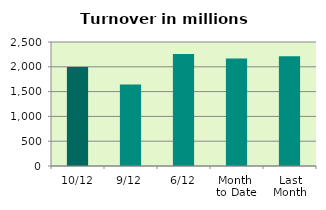
| Category | Series 0 |
|---|---|
| 10/12 | 1994.123 |
| 9/12 | 1640.853 |
| 6/12 | 2260.235 |
| Month 
to Date | 2165.411 |
| Last
Month | 2210.602 |